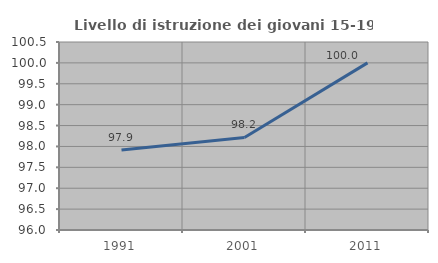
| Category | Livello di istruzione dei giovani 15-19 anni |
|---|---|
| 1991.0 | 97.917 |
| 2001.0 | 98.214 |
| 2011.0 | 100 |